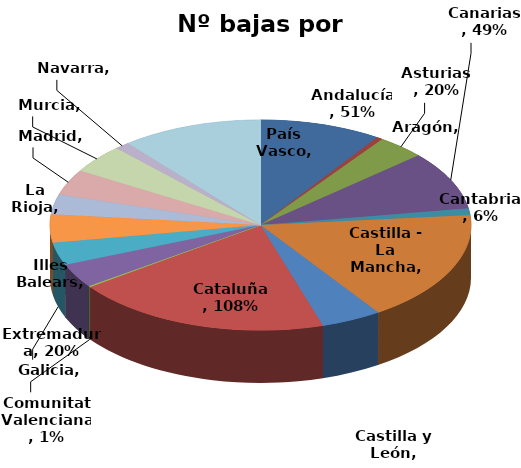
| Category | Nº bajas por enfermedad |
|---|---|
| Andalucía | 0.508 |
| Aragón | 0.025 |
| Asturias | 0.2 |
| Canarias | 0.49 |
| Cantabria | 0.056 |
| Castilla - La Mancha | 0.931 |
| Castilla y León | 0.253 |
| Cataluña | 1.076 |
| Comunitat Valenciana | 0.01 |
| Extremadura | 0.201 |
| Galicia | 0.19 |
| Illes Balears | 0.236 |
| La Rioja | 0.167 |
| Madrid | 0.214 |
| Murcia | 0.239 |
| Navarra | 0.062 |
| País Vasco | 0.591 |